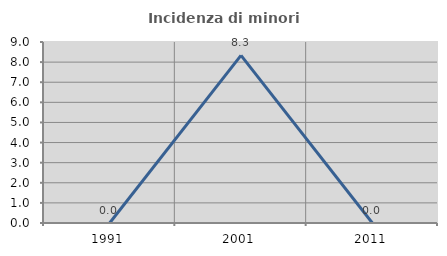
| Category | Incidenza di minori stranieri |
|---|---|
| 1991.0 | 0 |
| 2001.0 | 8.333 |
| 2011.0 | 0 |